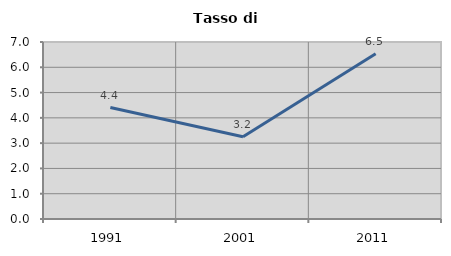
| Category | Tasso di disoccupazione   |
|---|---|
| 1991.0 | 4.409 |
| 2001.0 | 3.25 |
| 2011.0 | 6.539 |